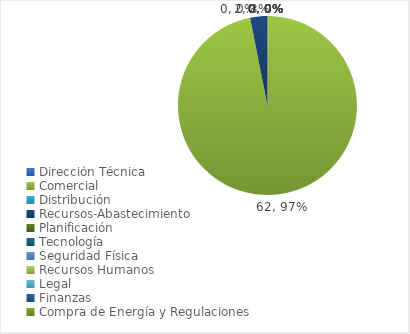
| Category | Series 0 |
|---|---|
| Dirección Técnica | 0 |
| Comercial | 62 |
| Distribución | 0 |
| Recursos-Abastecimiento | 2 |
| Planificación | 0 |
| Tecnología | 0 |
| Seguridad Física | 0 |
| Recursos Humanos | 0 |
| Legal | 0 |
| Finanzas | 0 |
| Compra de Energía y Regulaciones | 0 |